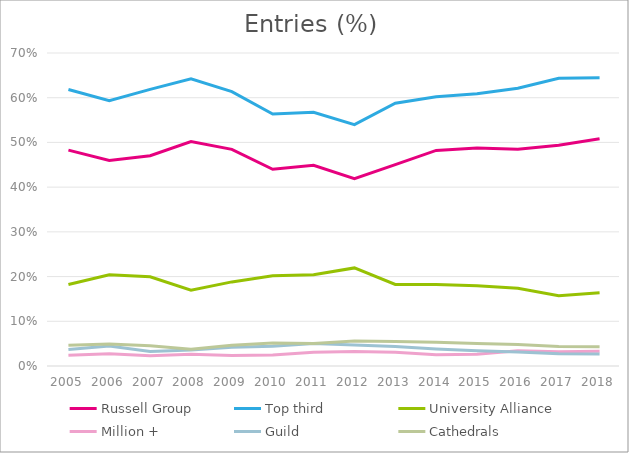
| Category | Russell Group | Top third | University Alliance | Million + | Guild | Cathedrals |
|---|---|---|---|---|---|---|
| 2005.0 | 0.483 | 0.618 | 0.182 | 0.024 | 0.037 | 0.046 |
| 2006.0 | 0.46 | 0.593 | 0.204 | 0.027 | 0.045 | 0.049 |
| 2007.0 | 0.47 | 0.619 | 0.2 | 0.023 | 0.032 | 0.045 |
| 2008.0 | 0.502 | 0.642 | 0.17 | 0.026 | 0.036 | 0.038 |
| 2009.0 | 0.485 | 0.614 | 0.188 | 0.023 | 0.042 | 0.046 |
| 2010.0 | 0.44 | 0.563 | 0.202 | 0.025 | 0.044 | 0.052 |
| 2011.0 | 0.449 | 0.567 | 0.204 | 0.031 | 0.05 | 0.051 |
| 2012.0 | 0.419 | 0.54 | 0.219 | 0.032 | 0.047 | 0.056 |
| 2013.0 | 0.45 | 0.588 | 0.182 | 0.031 | 0.044 | 0.055 |
| 2014.0 | 0.482 | 0.602 | 0.182 | 0.025 | 0.038 | 0.053 |
| 2015.0 | 0.487 | 0.609 | 0.179 | 0.026 | 0.034 | 0.051 |
| 2016.0 | 0.485 | 0.621 | 0.174 | 0.034 | 0.031 | 0.048 |
| 2017.0 | 0.494 | 0.643 | 0.157 | 0.032 | 0.028 | 0.043 |
| 2018.0 | 0.508 | 0.645 | 0.164 | 0.033 | 0.027 | 0.043 |